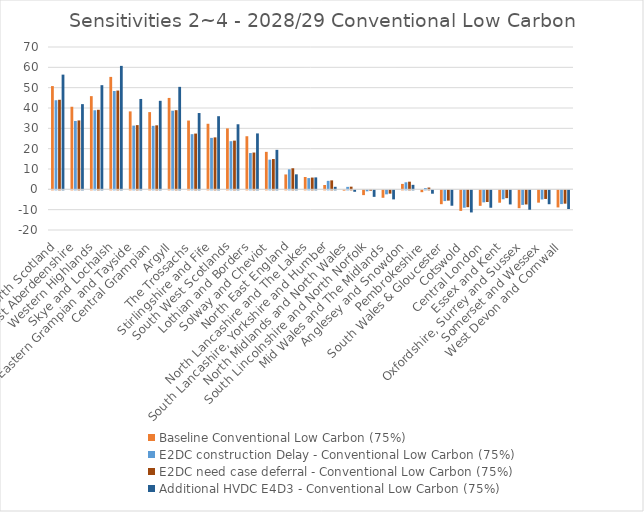
| Category | Baseline Conventional Low Carbon (75%) | E2DC construction Delay - Conventional Low Carbon (75%) | E2DC need case deferral - Conventional Low Carbon (75%) | Additional HVDC E4D3 - Conventional Low Carbon (75%) |
|---|---|---|---|---|
| North Scotland |  |  |  | 56.412 |
| East Aberdeenshire |  |  |  | 41.899 |
| Western Highlands |  |  |  | 51.226 |
| Skye and Lochalsh |  |  |  | 60.714 |
| Eastern Grampian and Tayside |  |  |  | 44.449 |
| Central Grampian |  |  |  | 43.533 |
| Argyll |  |  |  | 50.394 |
| The Trossachs |  |  |  | 37.525 |
| Stirlingshire and Fife |  |  |  | 35.966 |
| South West Scotlands |  |  |  | 32.005 |
| Lothian and Borders |  |  |  | 27.5 |
| Solway and Cheviot |  |  |  | 19.424 |
| North East England |  |  |  | 7.38 |
| North Lancashire and The Lakes |  |  |  | 5.872 |
| South Lancashire, Yorkshire and Humber |  |  |  | 1.245 |
| North Midlands and North Wales |  |  |  | -0.712 |
| South Lincolnshire and North Norfolk |  |  |  | -3.209 |
| Mid Wales and The Midlands |  |  |  | -4.452 |
| Anglesey and Snowdon |  |  |  | 2.212 |
| Pembrokeshire |  |  |  | -1.661 |
| South Wales & Gloucester |  |  |  | -7.574 |
| Cotswold |  |  |  | -10.877 |
| Central London |  |  |  | -8.561 |
| Essex and Kent |  |  |  | -6.929 |
| Oxfordshire, Surrey and Sussex |  |  |  | -9.543 |
| Somerset and Wessex |  |  |  | -6.834 |
| West Devon and Cornwall |  |  |  | -9.178 |